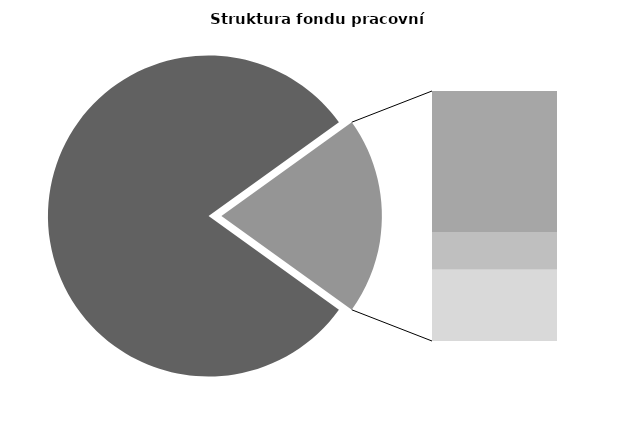
| Category | Series 0 |
|---|---|
| Průměrná měsíční odpracovaná doba bez přesčasu | 138.431 |
| Dovolená | 19.345 |
| Nemoc | 5.161 |
| Jiné | 9.787 |